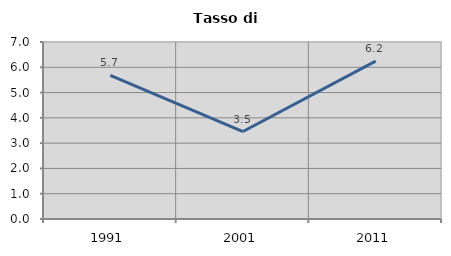
| Category | Tasso di disoccupazione   |
|---|---|
| 1991.0 | 5.679 |
| 2001.0 | 3.46 |
| 2011.0 | 6.242 |